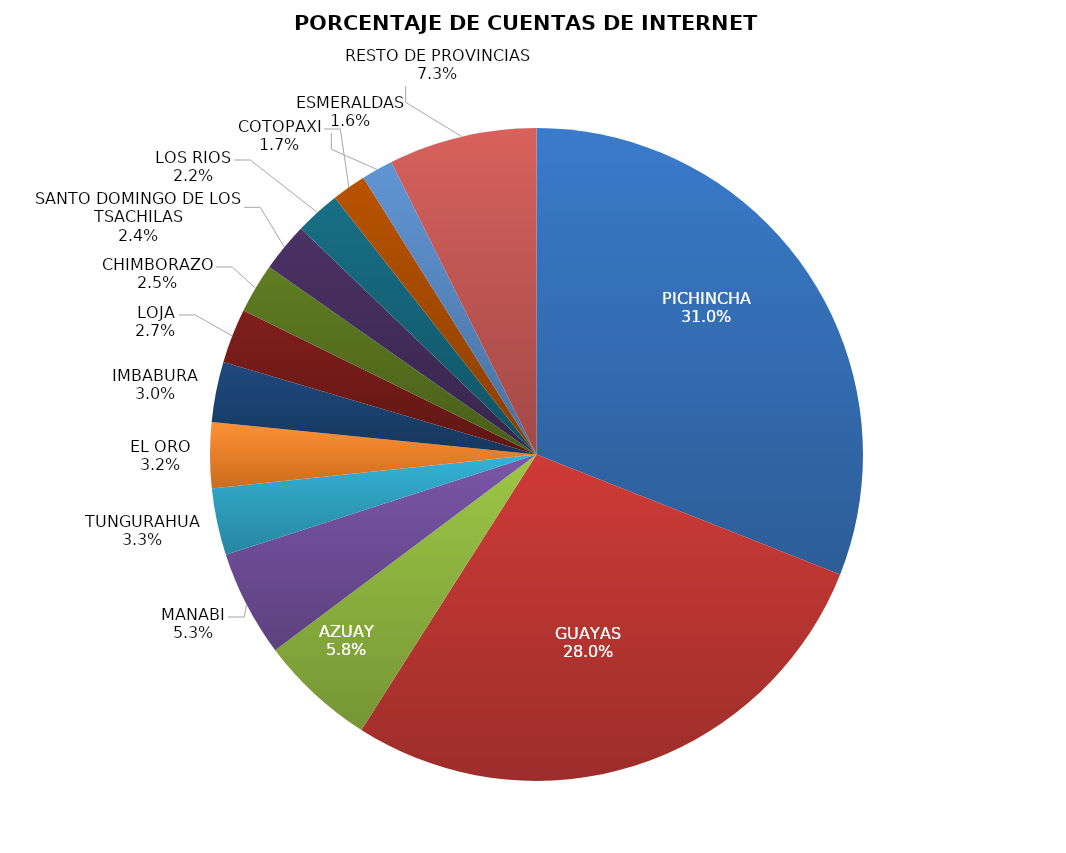
| Category | PORCENTAJE DE CUENTAS DE INTERNET FIJO |
|---|---|
| PICHINCHA | 0.31 |
| GUAYAS | 0.28 |
| AZUAY | 0.058 |
| MANABI | 0.053 |
| TUNGURAHUA | 0.033 |
| EL ORO | 0.032 |
| IMBABURA | 0.03 |
| LOJA | 0.027 |
| CHIMBORAZO | 0.025 |
| SANTO DOMINGO DE LOS TSACHILAS | 0.024 |
| LOS RIOS | 0.022 |
| COTOPAXI | 0.017 |
| ESMERALDAS | 0.016 |
| RESTO DE PROVINCIAS | 0.073 |